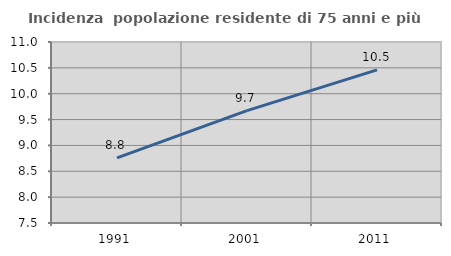
| Category | Incidenza  popolazione residente di 75 anni e più |
|---|---|
| 1991.0 | 8.759 |
| 2001.0 | 9.673 |
| 2011.0 | 10.461 |